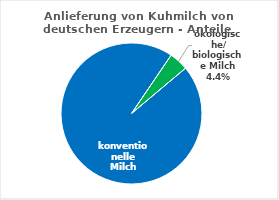
| Category | Anlieferung von Kuhmilch von deutschen Erzeugern - Anteile 2023 |
|---|---|
| konventionelle Milch | 0.956 |
| ökologische/ biologische Milch | 0.044 |